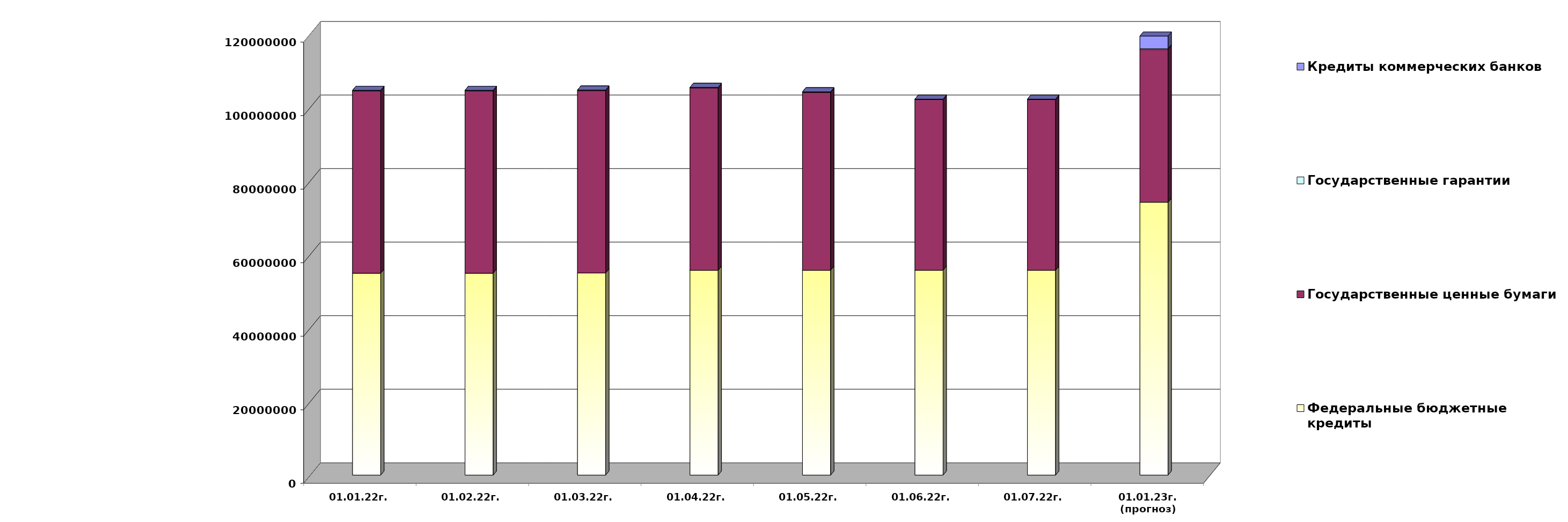
| Category | Федеральные бюджетные кредиты | Государственные ценные бумаги  | Государственные гарантии | Кредиты коммерческих банков |
|---|---|---|---|---|
| 01.01.22г. | 54900618.713 | 49600000 | 141570.67 | 0 |
| 01.02.22г. | 54900618.713 | 49600000 | 139748.87 | 0 |
| 01.03.22г. | 54970753.113 | 49600000 | 139748.87 | 0 |
| 01.04.22г. | 55700753.113 | 49600000 | 139748.87 | 0 |
| 01.05.22г. | 55700753.113 | 48400000 | 138270.964 | 0 |
| 01.06.22г. | 55705077.413 | 46400000 | 138270.964 | 0 |
| 01.07.22г. | 55705077.413 | 46400000 | 138270.964 | 0 |
| 01.01.23г.
(прогноз) | 74199281.9 | 41500000 | 265278.1 | 3438072.1 |